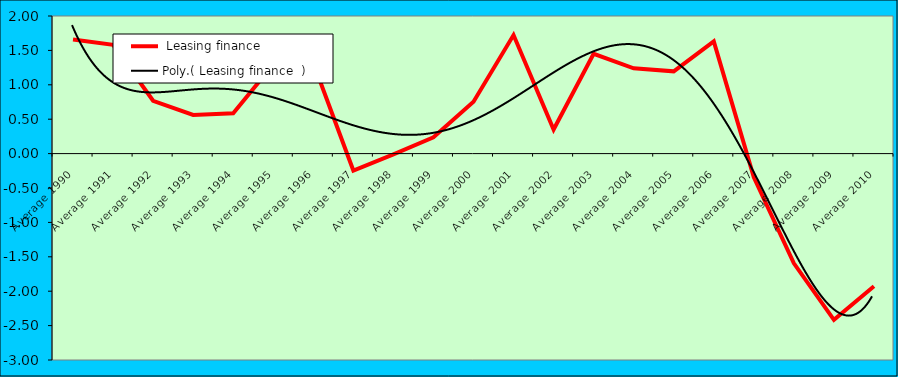
| Category |  Leasing finance   |
|---|---|
| Average 1990 | 1.659 |
| Average 1991 | 1.582 |
| Average 1992 | 0.768 |
| Average 1993 | 0.562 |
| Average 1994 | 0.587 |
| Average 1995 | 1.297 |
| Average 1996 | 1.318 |
| Average 1997 | -0.247 |
| Average 1998 | -0.01 |
| Average 1999 | 0.237 |
| Average 2000 | 0.755 |
| Average 2001 | 1.723 |
| Average 2002 | 0.35 |
| Average 2003 | 1.451 |
| Average 2004 | 1.24 |
| Average 2005 | 1.195 |
| Average 2006 | 1.63 |
| Average 2007 | -0.346 |
| Average 2008 | -1.595 |
| Average 2009 | -2.417 |
| Average 2010 | -1.927 |